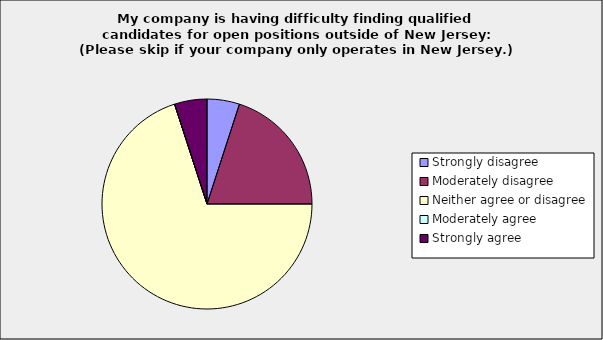
| Category | Series 0 |
|---|---|
| Strongly disagree | 0.05 |
| Moderately disagree | 0.2 |
| Neither agree or disagree | 0.7 |
| Moderately agree | 0 |
| Strongly agree | 0.05 |